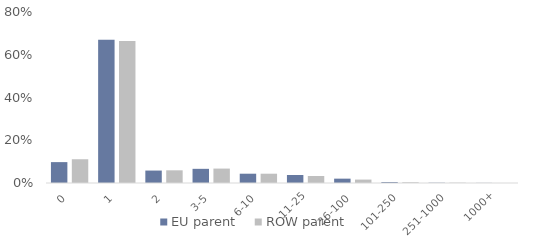
| Category | EU parent | ROW parent |
|---|---|---|
| 0 | 0.098 | 0.111 |
| 1 | 0.67 | 0.665 |
| 2 | 0.058 | 0.059 |
| 3-5 | 0.066 | 0.067 |
| 6-10 | 0.043 | 0.044 |
| 11-25 | 0.037 | 0.033 |
| 26-100 | 0.02 | 0.016 |
| 101-250 | 0.005 | 0.004 |
| 251-1000 | 0.001 | 0.001 |
| 1000+ | 0 | 0 |